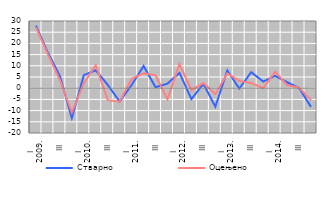
| Category | Стварно | Оцењено |
|---|---|---|
| I
2009. | 27.953 | 27.199 |
| II | 15.791 | 15.073 |
| III | 5.403 | 3.707 |
| IV | -13.352 | -10.86 |
| I
2010. | 5.805 | 2.269 |
| II | 7.998 | 10.239 |
| III | 1.471 | -5.342 |
| IV | -6.002 | -6.04 |
| I
2011. | 1.437 | 4.219 |
| II | 9.961 | 6.628 |
| III | 0.441 | 5.764 |
| IV | 2.059 | -4.871 |
| I
2012. | 6.808 | 10.797 |
| II | -4.851 | -0.904 |
| III | 1.946 | 2.286 |
| IV | -8.281 | -2.694 |
| I
2013. | 7.886 | 6.565 |
| II | -0.126 | 3.277 |
| III | 7.131 | 2.295 |
| IV | 2.953 | 0.016 |
| I
2014. | 5.462 | 7.272 |
| II | 2.661 | 1.419 |
| III | 0.06 | 0.24 |
| IV | -8.335 | -5.313 |